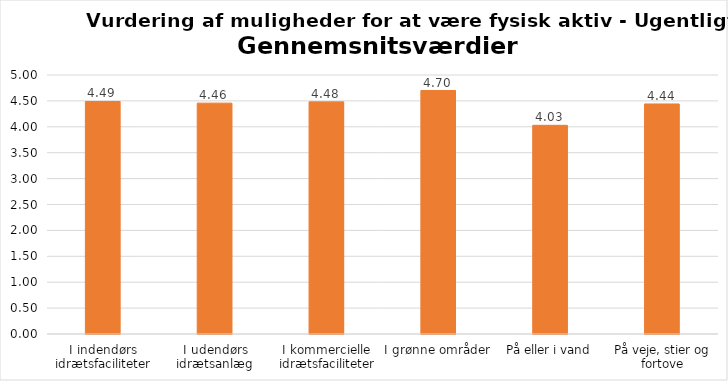
| Category | Gennemsnit |
|---|---|
| I indendørs idrætsfaciliteter | 4.489 |
| I udendørs idrætsanlæg | 4.457 |
| I kommercielle idrætsfaciliteter | 4.481 |
| I grønne områder | 4.7 |
| På eller i vand | 4.029 |
| På veje, stier og fortove | 4.441 |